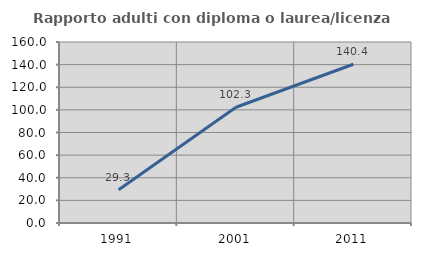
| Category | Rapporto adulti con diploma o laurea/licenza media  |
|---|---|
| 1991.0 | 29.335 |
| 2001.0 | 102.305 |
| 2011.0 | 140.361 |